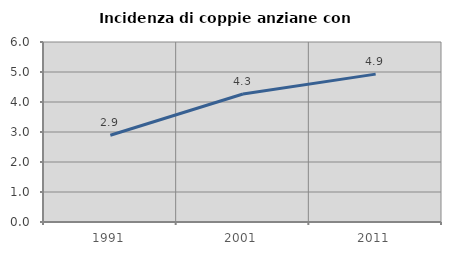
| Category | Incidenza di coppie anziane con figli |
|---|---|
| 1991.0 | 2.891 |
| 2001.0 | 4.268 |
| 2011.0 | 4.929 |